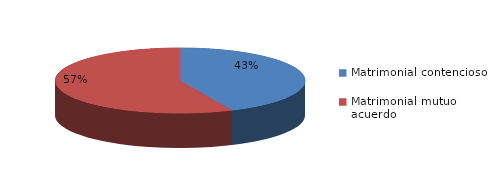
| Category | Series 0 |
|---|---|
| 0 | 219 |
| 1 | 288 |